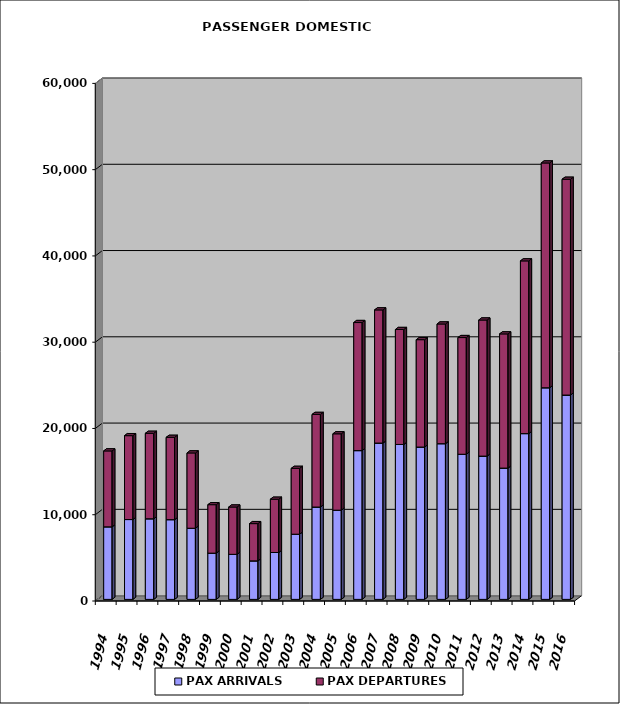
| Category | PAX ARRIVALS | PAX DEPARTURES |
|---|---|---|
| 1994.0 | 8411 | 8800 |
| 1995.0 | 9256 | 9723 |
| 1996.0 | 9344 | 9907 |
| 1997.0 | 9243 | 9541 |
| 1998.0 | 8247 | 8729 |
| 1999.0 | 5360 | 5618 |
| 2000.0 | 5222 | 5484 |
| 2001.0 | 4464 | 4318 |
| 2002.0 | 5436 | 6173 |
| 2003.0 | 7557 | 7629 |
| 2004.0 | 10706 | 10733 |
| 2005.0 | 10340 | 8853 |
| 2006.0 | 17247 | 14845 |
| 2007.0 | 18121 | 15436 |
| 2008.0 | 17959 | 13326 |
| 2009.0 | 17659 | 12447 |
| 2010.0 | 18049 | 13875 |
| 2011.0 | 16822 | 13529 |
| 2012.0 | 16608 | 15777 |
| 2013.0 | 15220 | 15554 |
| 2014.0 | 19217 | 20021 |
| 2015.0 | 24531 | 26058 |
| 2016.0 | 23685 | 25015 |